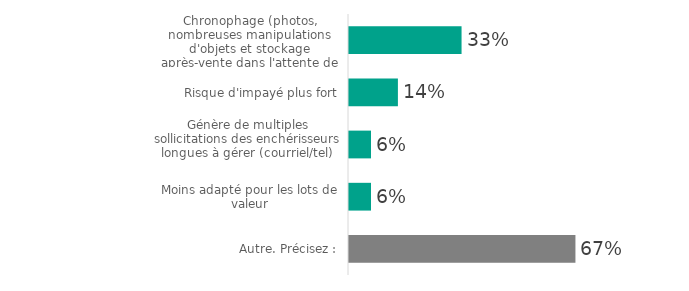
| Category | Series 0 |
|---|---|
| Chronophage (photos, nombreuses manipulations d'objets et stockage après-vente dans l'attente de la livraison/retrait des lots..) | 33.202 |
| Risque d'impayé plus fort | 14.425 |
| Génère de multiples sollicitations des enchérisseurs longues à gérer (courriel/tel) | 6.493 |
| Moins adapté pour les lots de valeur | 6.493 |
| Autre. Précisez : | 66.798 |